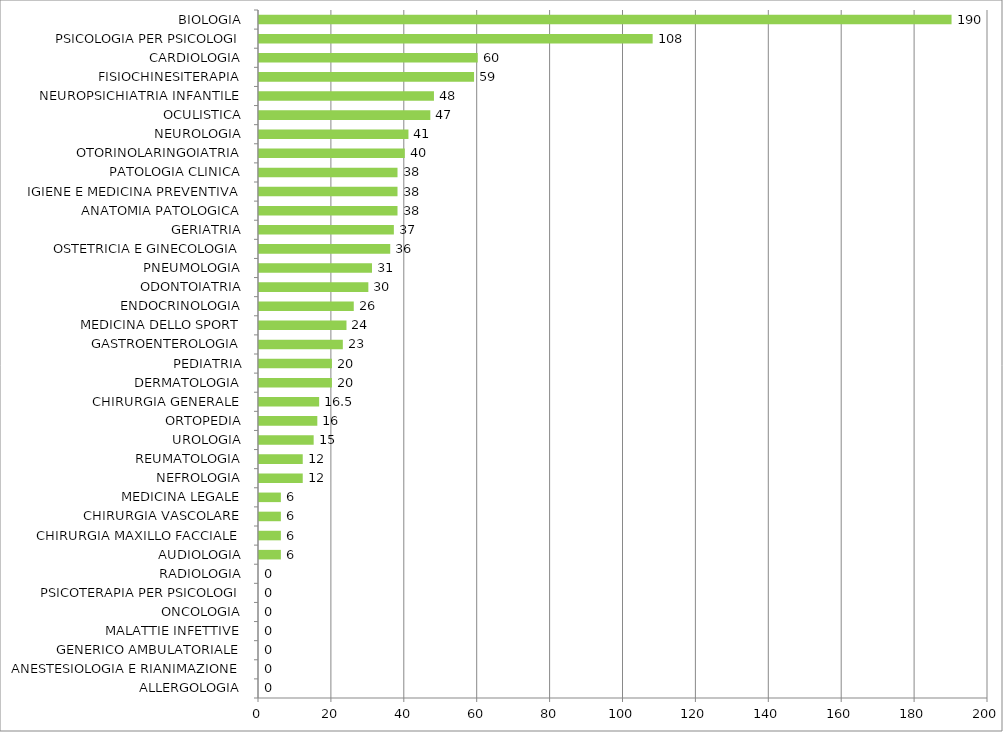
| Category | Series 0 |
|---|---|
| ALLERGOLOGIA | 0 |
| ANESTESIOLOGIA E RIANIMAZIONE | 0 |
| GENERICO AMBULATORIALE | 0 |
| MALATTIE INFETTIVE | 0 |
| ONCOLOGIA | 0 |
| PSICOTERAPIA PER PSICOLOGI | 0 |
| RADIOLOGIA | 0 |
| AUDIOLOGIA | 6 |
| CHIRURGIA MAXILLO FACCIALE | 6 |
| CHIRURGIA VASCOLARE | 6 |
| MEDICINA LEGALE | 6 |
| NEFROLOGIA | 12 |
| REUMATOLOGIA | 12 |
| UROLOGIA | 15 |
| ORTOPEDIA | 16 |
| CHIRURGIA GENERALE | 16.5 |
| DERMATOLOGIA | 20 |
| PEDIATRIA | 20 |
| GASTROENTEROLOGIA | 23 |
| MEDICINA DELLO SPORT | 24 |
| ENDOCRINOLOGIA | 26 |
| ODONTOIATRIA | 30 |
| PNEUMOLOGIA | 31 |
| OSTETRICIA E GINECOLOGIA | 36 |
| GERIATRIA | 37 |
| ANATOMIA PATOLOGICA | 38 |
| IGIENE E MEDICINA PREVENTIVA | 38 |
| PATOLOGIA CLINICA | 38 |
| OTORINOLARINGOIATRIA | 40 |
| NEUROLOGIA | 41 |
| OCULISTICA | 47 |
| NEUROPSICHIATRIA INFANTILE | 48 |
| FISIOCHINESITERAPIA | 59 |
| CARDIOLOGIA | 60 |
| PSICOLOGIA PER PSICOLOGI | 108 |
| BIOLOGIA | 190 |